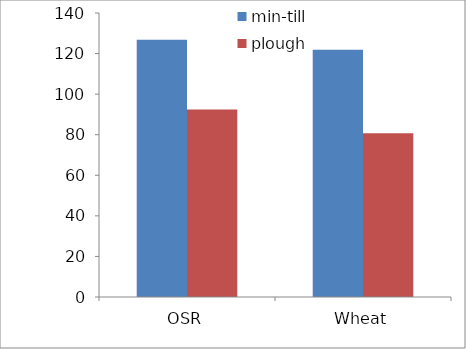
| Category | min-till | plough |
|---|---|---|
| OSR | 126.765 | 92.47 |
| Wheat | 121.899 | 80.724 |